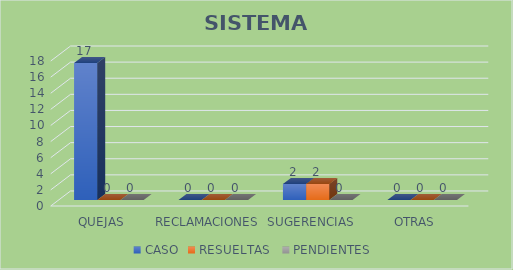
| Category | CASO | RESUELTAS  | PENDIENTES  |
|---|---|---|---|
| QUEJAS | 17 | 0 | 0 |
| RECLAMACIONES | 0 | 0 | 0 |
| SUGERENCIAS | 2 | 2 | 0 |
| OTRAS | 0 | 0 | 0 |